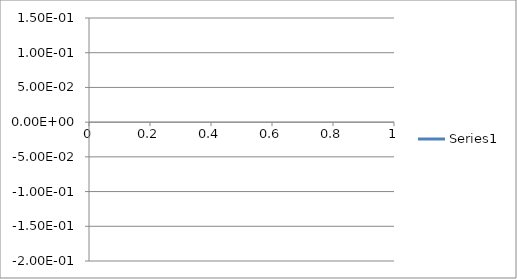
| Category | Series 0 |
|---|---|
| 0 | 0 |
| 1 | 0 |
| 2 | 0 |
| 3 | 0 |
| 4 | 0 |
| 5 | 0 |
| 6 | 0 |
| 7 | 0 |
| 8 | 0 |
| 9 | 0 |
| 10 | 0 |
| 11 | 0 |
| 12 | 0 |
| 13 | 0 |
| 14 | 0 |
| 15 | 0 |
| 16 | 0 |
| 17 | 0 |
| 18 | 0 |
| 19 | 0 |
| 20 | 0 |
| 21 | 0.001 |
| 22 | 0.001 |
| 23 | 0.001 |
| 24 | 0.001 |
| 25 | 0.001 |
| 26 | 0.001 |
| 27 | 0.001 |
| 28 | 0.001 |
| 29 | 0.001 |
| 30 | 0.001 |
| 31 | 0.002 |
| 32 | 0.004 |
| 33 | 0.006 |
| 34 | 0.003 |
| 35 | -0.003 |
| 36 | -0.014 |
| 37 | -0.032 |
| 38 | -0.066 |
| 39 | -0.108 |
| 40 | -0.131 |
| 41 | -0.107 |
| 42 | -0.043 |
| 43 | 0.023 |
| 44 | 0.048 |
| 45 | 0.021 |
| 46 | -0.037 |
| 47 | -0.098 |
| 48 | -0.144 |
| 49 | -0.166 |
| 50 | -0.163 |
| 51 | -0.139 |
| 52 | -0.103 |
| 53 | -0.063 |
| 54 | -0.02 |
| 55 | 0.026 |
| 56 | 0.07 |
| 57 | 0.105 |
| 58 | 0.125 |
| 59 | 0.128 |
| 60 | 0.12 |
| 61 | 0.108 |
| 62 | 0.099 |
| 63 | 0.096 |
| 64 | 0.097 |
| 65 | 0.098 |
| 66 | 0.096 |
| 67 | 0.09 |
| 68 | 0.082 |
| 69 | 0.072 |
| 70 | 0.061 |
| 71 | 0.049 |
| 72 | 0.038 |
| 73 | 0.031 |
| 74 | 0.031 |
| 75 | 0.038 |
| 76 | 0.051 |
| 77 | 0.067 |
| 78 | 0.082 |
| 79 | 0.094 |
| 80 | 0.104 |
| 81 | 0.109 |
| 82 | 0.109 |
| 83 | 0.104 |
| 84 | 0.092 |
| 85 | 0.076 |
| 86 | 0.058 |
| 87 | 0.04 |
| 88 | 0.022 |
| 89 | 0.008 |
| 90 | -0.002 |
| 91 | -0.006 |
| 92 | -0.003 |
| 93 | 0.006 |
| 94 | 0.018 |
| 95 | 0.031 |
| 96 | 0.042 |
| 97 | 0.049 |
| 98 | 0.052 |
| 99 | 0.05 |
| 100 | 0.043 |
| 101 | 0.035 |
| 102 | 0.025 |
| 103 | 0.016 |
| 104 | 0.01 |
| 105 | 0.005 |
| 106 | 0.003 |
| 107 | 0.003 |
| 108 | 0.006 |
| 109 | 0.01 |
| 110 | 0.014 |
| 111 | 0.02 |
| 112 | 0.024 |
| 113 | 0.028 |
| 114 | 0.031 |
| 115 | 0.032 |
| 116 | 0.032 |
| 117 | 0.031 |
| 118 | 0.028 |
| 119 | 0.025 |
| 120 | 0.021 |
| 121 | 0.017 |
| 122 | 0.014 |
| 123 | 0.012 |
| 124 | 0.011 |
| 125 | 0.009 |
| 126 | 0.007 |
| 127 | 0.004 |
| 128 | -0.001 |
| 129 | -0.007 |
| 130 | -0.013 |
| 131 | -0.018 |
| 132 | -0.022 |
| 133 | -0.024 |
| 134 | -0.024 |
| 135 | -0.021 |
| 136 | -0.017 |
| 137 | -0.011 |
| 138 | -0.005 |
| 139 | 0.001 |
| 140 | 0.006 |
| 141 | 0.012 |
| 142 | 0.018 |
| 143 | 0.022 |
| 144 | 0.026 |
| 145 | 0.027 |
| 146 | 0.027 |
| 147 | 0.025 |
| 148 | 0.022 |
| 149 | 0.019 |
| 150 | 0.016 |
| 151 | 0.013 |
| 152 | 0.012 |
| 153 | 0.012 |
| 154 | 0.012 |
| 155 | 0.014 |
| 156 | 0.016 |
| 157 | 0.018 |
| 158 | 0.02 |
| 159 | 0.022 |
| 160 | 0.023 |
| 161 | 0.025 |
| 162 | 0.027 |
| 163 | 0.028 |
| 164 | 0.03 |
| 165 | 0.031 |
| 166 | 0.031 |
| 167 | 0.031 |
| 168 | 0.03 |
| 169 | 0.028 |
| 170 | 0.026 |
| 171 | 0.023 |
| 172 | 0.019 |
| 173 | 0.016 |
| 174 | 0.012 |
| 175 | 0.009 |
| 176 | 0.007 |
| 177 | 0.006 |
| 178 | 0.005 |
| 179 | 0.005 |
| 180 | 0.005 |
| 181 | 0.006 |
| 182 | 0.007 |
| 183 | 0.008 |
| 184 | 0.01 |
| 185 | 0.013 |
| 186 | 0.015 |
| 187 | 0.018 |
| 188 | 0.019 |
| 189 | 0.02 |
| 190 | 0.019 |
| 191 | 0.018 |
| 192 | 0.017 |
| 193 | 0.015 |
| 194 | 0.014 |
| 195 | 0.013 |
| 196 | 0.011 |
| 197 | 0.01 |
| 198 | 0.009 |
| 199 | 0.007 |
| 200 | 0.006 |
| 201 | 0.005 |
| 202 | 0.004 |
| 203 | 0.004 |
| 204 | 0.005 |
| 205 | 0.006 |
| 206 | 0.007 |
| 207 | 0.009 |
| 208 | 0.01 |
| 209 | 0.012 |
| 210 | 0.014 |
| 211 | 0.016 |
| 212 | 0.017 |
| 213 | 0.019 |
| 214 | 0.02 |
| 215 | 0.022 |
| 216 | 0.023 |
| 217 | 0.023 |
| 218 | 0.022 |
| 219 | 0.02 |
| 220 | 0.018 |
| 221 | 0.016 |
| 222 | 0.014 |
| 223 | 0.012 |
| 224 | 0.011 |
| 225 | 0.009 |
| 226 | 0.008 |
| 227 | 0.008 |
| 228 | 0.007 |
| 229 | 0.007 |
| 230 | 0.007 |
| 231 | 0.008 |
| 232 | 0.009 |
| 233 | 0.01 |
| 234 | 0.011 |
| 235 | 0.013 |
| 236 | 0.014 |
| 237 | 0.015 |
| 238 | 0.017 |
| 239 | 0.018 |
| 240 | 0.019 |
| 241 | 0.021 |
| 242 | 0.022 |
| 243 | 0.023 |
| 244 | 0.023 |
| 245 | 0.023 |
| 246 | 0.022 |
| 247 | 0.021 |
| 248 | 0.019 |
| 249 | 0.018 |
| 250 | 0.017 |
| 251 | 0.015 |
| 252 | 0.014 |
| 253 | 0.013 |
| 254 | 0.012 |
| 255 | 0.012 |
| 256 | 0.012 |
| 257 | 0.012 |
| 258 | 0.013 |
| 259 | 0.014 |
| 260 | 0.015 |
| 261 | 0.015 |
| 262 | 0.015 |
| 263 | 0.015 |
| 264 | 0.014 |
| 265 | 0.014 |
| 266 | 0.013 |
| 267 | 0.013 |
| 268 | 0.012 |
| 269 | 0.012 |
| 270 | 0.012 |
| 271 | 0.012 |
| 272 | 0.012 |
| 273 | 0.012 |
| 274 | 0.012 |
| 275 | 0.012 |
| 276 | 0.012 |
| 277 | 0.013 |
| 278 | 0.013 |
| 279 | 0.013 |
| 280 | 0.013 |
| 281 | 0.014 |
| 282 | 0.014 |
| 283 | 0.015 |
| 284 | 0.015 |
| 285 | 0.016 |
| 286 | 0.016 |
| 287 | 0.016 |
| 288 | 0.016 |
| 289 | 0.016 |
| 290 | 0.015 |
| 291 | 0.015 |
| 292 | 0.014 |
| 293 | 0.014 |
| 294 | 0.014 |
| 295 | 0.013 |
| 296 | 0.013 |
| 297 | 0.013 |
| 298 | 0.012 |
| 299 | 0.012 |
| 300 | 0.012 |
| 301 | 0.013 |
| 302 | 0.013 |
| 303 | 0.014 |
| 304 | 0.015 |
| 305 | 0.016 |
| 306 | 0.017 |
| 307 | 0.018 |
| 308 | 0.018 |
| 309 | 0.019 |
| 310 | 0.019 |
| 311 | 0.019 |
| 312 | 0.019 |
| 313 | 0.019 |
| 314 | 0.019 |
| 315 | 0.02 |
| 316 | 0.02 |
| 317 | 0.019 |
| 318 | 0.019 |
| 319 | 0.019 |
| 320 | 0.019 |
| 321 | 0.018 |
| 322 | 0.018 |
| 323 | 0.017 |
| 324 | 0.017 |
| 325 | 0.016 |
| 326 | 0.016 |
| 327 | 0.015 |
| 328 | 0.014 |
| 329 | 0.013 |
| 330 | 0.013 |
| 331 | 0.012 |
| 332 | 0.011 |
| 333 | 0.011 |
| 334 | 0.011 |
| 335 | 0.011 |
| 336 | 0.011 |
| 337 | 0.011 |
| 338 | 0.011 |
| 339 | 0.011 |
| 340 | 0.011 |
| 341 | 0.011 |
| 342 | 0.011 |
| 343 | 0.011 |
| 344 | 0.011 |
| 345 | 0.011 |
| 346 | 0.011 |
| 347 | 0.011 |
| 348 | 0.011 |
| 349 | 0.01 |
| 350 | 0.01 |
| 351 | 0.01 |
| 352 | 0.01 |
| 353 | 0.01 |
| 354 | 0.01 |
| 355 | 0.01 |
| 356 | 0.01 |
| 357 | 0.01 |
| 358 | 0.01 |
| 359 | 0.01 |
| 360 | 0.01 |
| 361 | 0.009 |
| 362 | 0.009 |
| 363 | 0.009 |
| 364 | 0.009 |
| 365 | 0.009 |
| 366 | 0.009 |
| 367 | 0.009 |
| 368 | 0.01 |
| 369 | 0.01 |
| 370 | 0.01 |
| 371 | 0.011 |
| 372 | 0.011 |
| 373 | 0.012 |
| 374 | 0.012 |
| 375 | 0.013 |
| 376 | 0.014 |
| 377 | 0.014 |
| 378 | 0.015 |
| 379 | 0.016 |
| 380 | 0.017 |
| 381 | 0.018 |
| 382 | 0.018 |
| 383 | 0.018 |
| 384 | 0.018 |
| 385 | 0.018 |
| 386 | 0.018 |
| 387 | 0.017 |
| 388 | 0.017 |
| 389 | 0.017 |
| 390 | 0.016 |
| 391 | 0.016 |
| 392 | 0.015 |
| 393 | 0.015 |
| 394 | 0.014 |
| 395 | 0.014 |
| 396 | 0.013 |
| 397 | 0.013 |
| 398 | 0.013 |
| 399 | 0.012 |
| 400 | 0.012 |